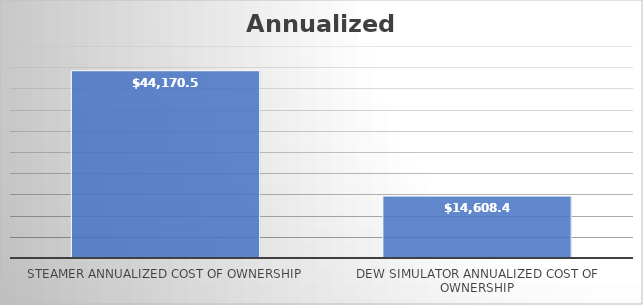
| Category | Series 0 |
|---|---|
| Steamer Annualized Cost of Ownership | 44170.59 |
| Dew Simulator Annualized Cost of Ownership | 14608.488 |